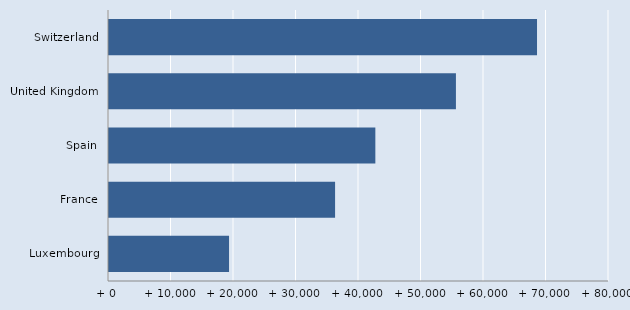
| Category | Series 0 |
|---|---|
| Switzerland | 68483 |
| United Kingdom | 55509 |
| Spain | 42616 |
| France | 36173 |
| Luxembourg | 19207 |